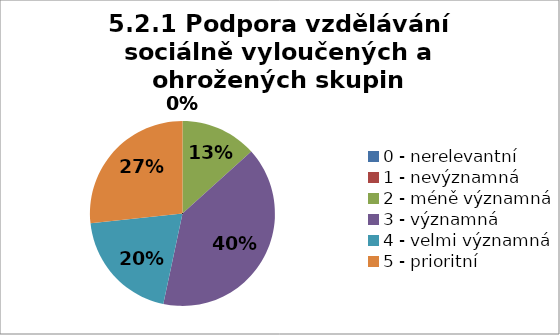
| Category | Series 5 | Series 4 | Series 3 | Series 2 | Series 1 | Series 0 |
|---|---|---|---|---|---|---|
| 0 - nerelevantní | 0 | 6.667 | 0 | 0 | 0 | 0 |
| 1 - nevýznamná | 0 | 0 | 0 | 6.667 | 0 | 0 |
| 2 - méně významná | 13.333 | 6.667 | 26.667 | 0 | 6.667 | 0 |
| 3 - významná | 40 | 40 | 46.667 | 53.333 | 46.667 | 33.333 |
| 4 - velmi významná | 20 | 26.667 | 13.333 | 40 | 33.333 | 40 |
| 5 - prioritní | 26.667 | 20 | 13.333 | 0 | 13.333 | 26.667 |